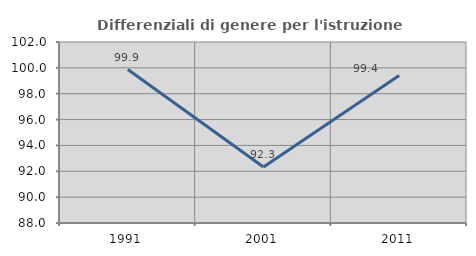
| Category | Differenziali di genere per l'istruzione superiore |
|---|---|
| 1991.0 | 99.87 |
| 2001.0 | 92.336 |
| 2011.0 | 99.405 |